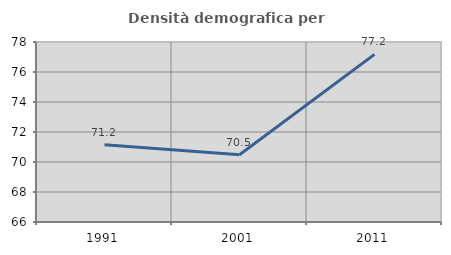
| Category | Densità demografica |
|---|---|
| 1991.0 | 71.154 |
| 2001.0 | 70.48 |
| 2011.0 | 77.177 |